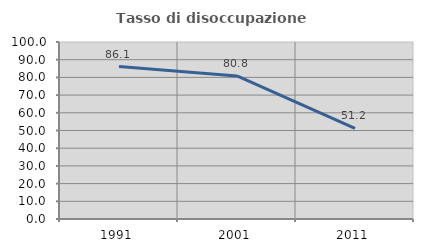
| Category | Tasso di disoccupazione giovanile  |
|---|---|
| 1991.0 | 86.138 |
| 2001.0 | 80.838 |
| 2011.0 | 51.175 |